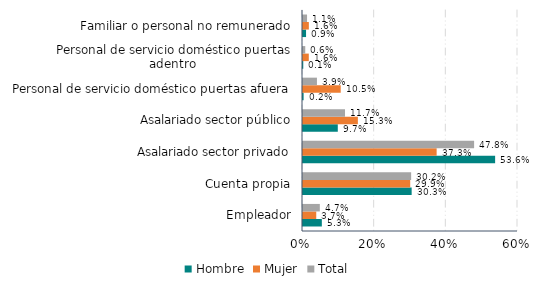
| Category | Hombre | Mujer | Total |
|---|---|---|---|
| Empleador | 0.053 | 0.037 | 0.047 |
| Cuenta propia | 0.303 | 0.299 | 0.302 |
| Asalariado sector privado | 0.536 | 0.373 | 0.478 |
| Asalariado sector público | 0.097 | 0.153 | 0.117 |
| Personal de servicio doméstico puertas afuera  | 0.002 | 0.105 | 0.039 |
| Personal de servicio doméstico puertas adentro  | 0.001 | 0.016 | 0.006 |
| Familiar o personal no remunerado | 0.009 | 0.016 | 0.011 |